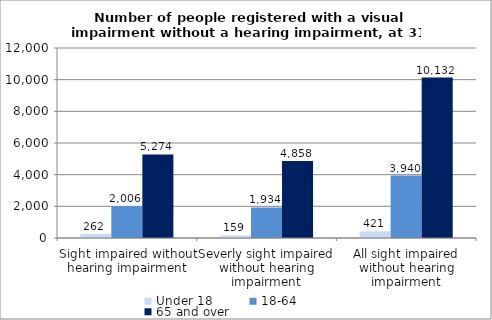
| Category | Under 18 | 18-64 | 65 and over |
|---|---|---|---|
| Sight impaired without hearing impairment | 262 | 2006 | 5274 |
| Severly sight impaired without hearing impairment | 159 | 1934 | 4858 |
| All sight impaired without hearing impairment | 421 | 3940 | 10132 |